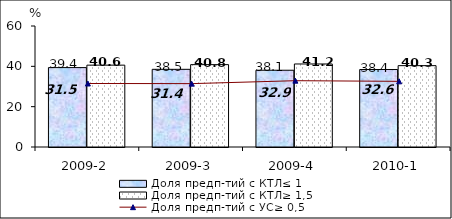
| Category | Доля предп-тий с КТЛ≤ 1 | Доля предп-тий с КТЛ≥ 1,5 |
|---|---|---|
| 2009-2 | 39.37 | 40.59 |
| 2009-3 | 38.52 | 40.84 |
| 2009-4 | 38.06 | 41.17 |
| 2010-1 | 38.42 | 40.34 |